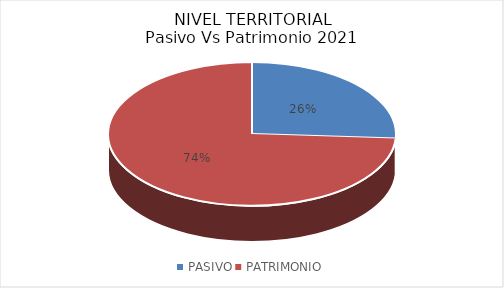
| Category | Series 0 |
|---|---|
| PASIVO | 177004271871.077 |
| PATRIMONIO | 502941840140.089 |